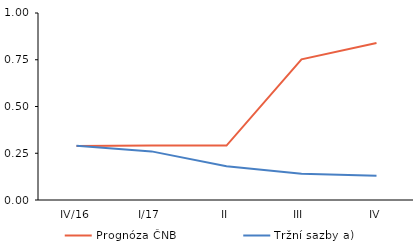
| Category | Prognóza ČNB | Tržní sazby a) |
|---|---|---|
| IV/16 | 0.289 | 0.29 |
| I/17 | 0.291 | 0.26 |
| II | 0.291 | 0.18 |
| III | 0.752 | 0.14 |
| IV | 0.84 | 0.13 |